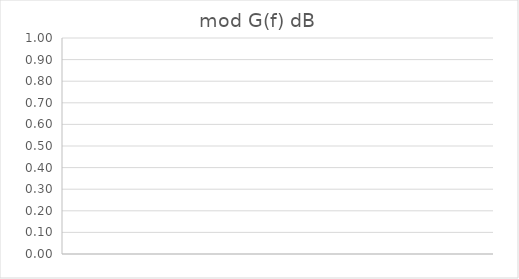
| Category | mod G(f) dB |
|---|---|
|  | 0 |
|  | 0 |
|  | 0 |
|  | 0 |
|  | 0 |
|  | 0 |
|  | 0 |
|  | 0 |
|  | 0 |
|  | 0 |
|  | 0 |
|  | 0 |
|  | 0 |
|  | 0 |
|  | 0 |
|  | 0 |
|  | 0 |
|  | 0 |